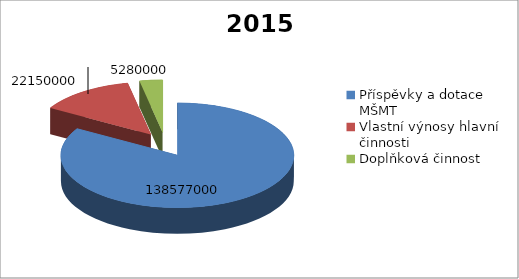
| Category | 2015 |
|---|---|
| Příspěvky a dotace MŠMT | 138577000 |
| Vlastní výnosy hlavní činnosti | 22150000 |
| Doplňková činnost | 5280000 |